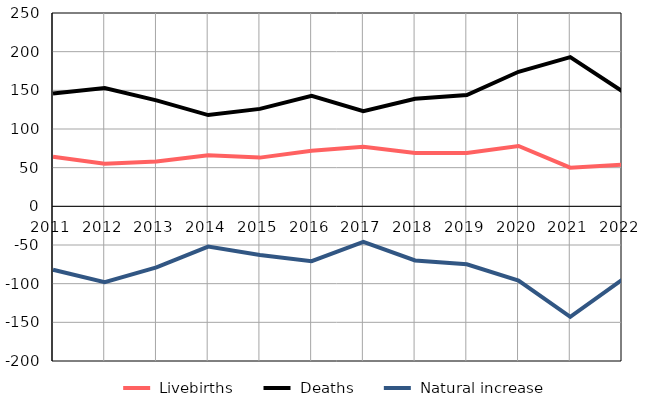
| Category |  Livebirths |  Deaths |  Natural increase |
|---|---|---|---|
| 2011.0 | 64 | 146 | -82 |
| 2012.0 | 55 | 153 | -98 |
| 2013.0 | 58 | 137 | -79 |
| 2014.0 | 66 | 118 | -52 |
| 2015.0 | 63 | 126 | -63 |
| 2016.0 | 72 | 143 | -71 |
| 2017.0 | 77 | 123 | -46 |
| 2018.0 | 69 | 139 | -70 |
| 2019.0 | 69 | 144 | -75 |
| 2020.0 | 78 | 174 | -96 |
| 2021.0 | 50 | 193 | -143 |
| 2022.0 | 54 | 149 | -95 |